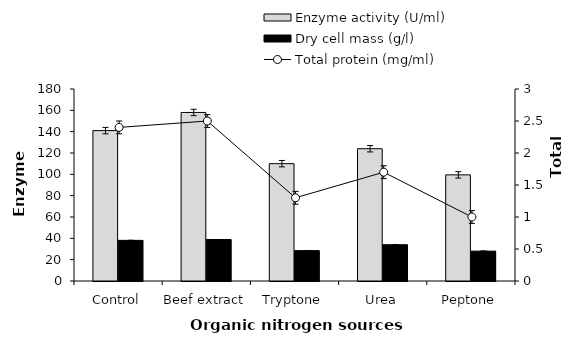
| Category | Enzyme activity (U/ml) | Dry cell mass (g/l) |
|---|---|---|
| Control | 141 | 38.1 |
| Beef extract | 158 | 38.9 |
| Tryptone | 110 | 28.5 |
| Urea | 124 | 34 |
| Peptone | 99.5 | 28 |